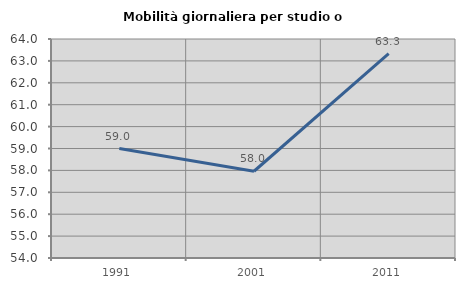
| Category | Mobilità giornaliera per studio o lavoro |
|---|---|
| 1991.0 | 59 |
| 2001.0 | 57.961 |
| 2011.0 | 63.337 |